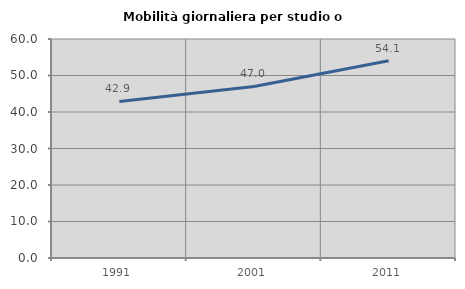
| Category | Mobilità giornaliera per studio o lavoro |
|---|---|
| 1991.0 | 42.892 |
| 2001.0 | 46.995 |
| 2011.0 | 54.062 |